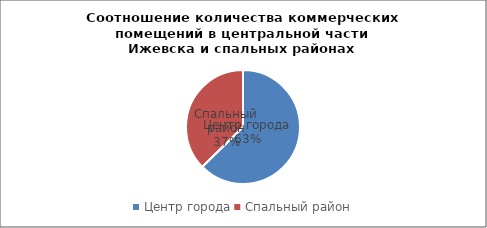
| Category | Series 0 |
|---|---|
| Центр города | 94 |
| Спальный район | 56 |